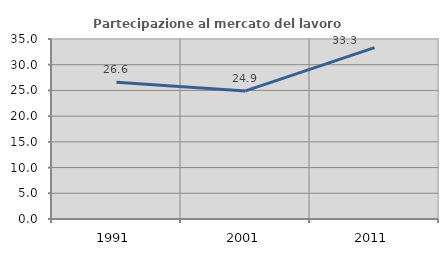
| Category | Partecipazione al mercato del lavoro  femminile |
|---|---|
| 1991.0 | 26.6 |
| 2001.0 | 24.9 |
| 2011.0 | 33.333 |